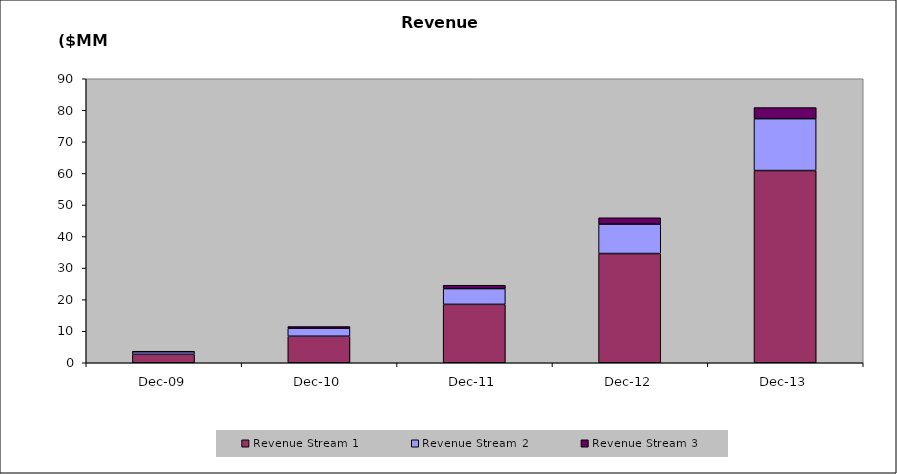
| Category | Revenue Stream 1 | Revenue Stream 2 | Revenue Stream 3 |
|---|---|---|---|
| 2009-12-31 | 2676900 | 803070 | 171290 |
| 2010-12-31 | 8412200 | 2523660 | 538340 |
| 2011-12-31 | 18506840 | 4996860 | 1065922 |
| 2012-12-30 | 34607815 | 9344128.2 | 1993281.4 |
| 2013-12-30 | 60909754.4 | 16445689.59 | 3508183.25 |